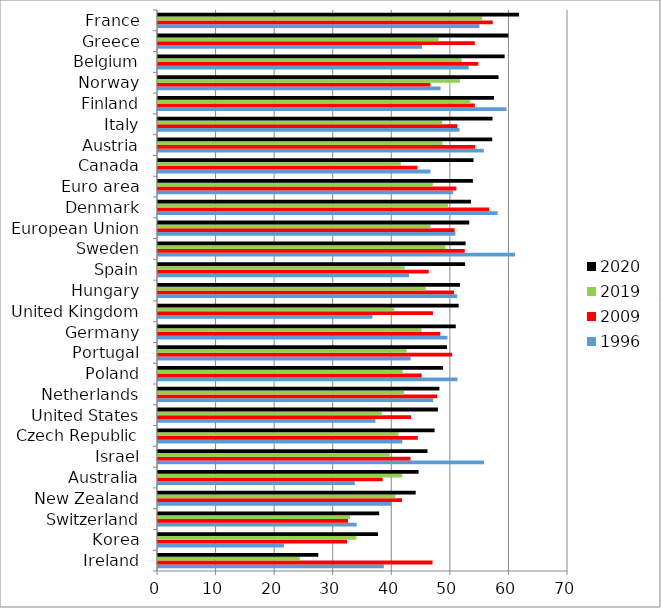
| Category | 1996 | 2009 | 2019 | 2020 |
|---|---|---|---|---|
| Ireland | 38.559 | 46.874 | 24.202 | 27.364 |
| Korea | 21.521 | 32.28 | 33.871 | 37.567 |
| Switzerland | 33.929 | 32.456 | 32.767 | 37.77 |
| New Zealand | 39.863 | 41.669 | 40.534 | 44 |
| Australia | 33.604 | 38.339 | 41.702 | 44.499 |
| Israel | 55.677 | 43.106 | 39.57 | 46.009 |
| Czech Republic | 41.697 | 44.357 | 41.062 | 47.224 |
| United States | 37.124 | 43.195 | 38.21 | 47.786 |
| Netherlands | 46.964 | 47.67 | 42.012 | 48.05 |
| Poland | 51.124 | 45.014 | 41.772 | 48.669 |
| Portugal | 43.149 | 50.223 | 42.451 | 49.341 |
| Germany | 49.419 | 48.2 | 44.991 | 50.842 |
| United Kingdom | 36.615 | 46.938 | 40.345 | 51.331 |
| Hungary | 51.084 | 50.542 | 45.71 | 51.57 |
| Spain | 42.849 | 46.231 | 42.112 | 52.434 |
| Sweden | 60.97 | 52.374 | 49.086 | 52.522 |
| European Union | 50.766 | 50.653 | 46.524 | 53.141 |
| Denmark | 57.998 | 56.536 | 49.517 | 53.434 |
| Euro area | 50.377 | 50.95 | 46.919 | 53.763 |
| Canada | 46.518 | 44.284 | 41.452 | 53.865 |
| Austria | 55.624 | 54.145 | 48.566 | 57.06 |
| Italy | 51.489 | 51.111 | 48.526 | 57.118 |
| Finland | 59.497 | 54.092 | 53.287 | 57.366 |
| Norway | 48.26 | 46.5 | 51.542 | 58.144 |
| Belgium | 53.052 | 54.681 | 51.844 | 59.185 |
| Greece | 45.083 | 54.084 | 47.89 | 59.804 |
| France | 54.881 | 57.152 | 55.352 | 61.645 |